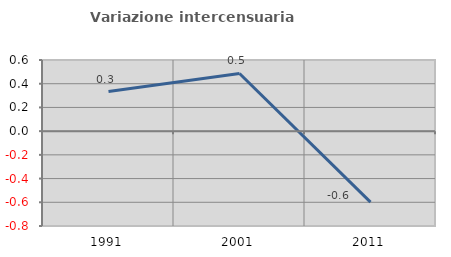
| Category | Variazione intercensuaria annua |
|---|---|
| 1991.0 | 0.334 |
| 2001.0 | 0.486 |
| 2011.0 | -0.599 |